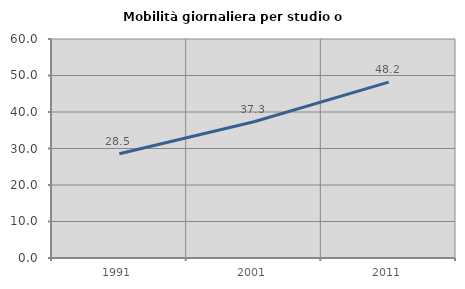
| Category | Mobilità giornaliera per studio o lavoro |
|---|---|
| 1991.0 | 28.549 |
| 2001.0 | 37.325 |
| 2011.0 | 48.196 |